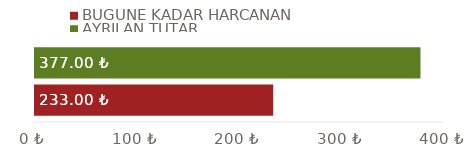
| Category | BUGÜNE KADAR HARCANAN | AYRILAN TUTAR |
|---|---|---|
| TOPLAMLAR | 233 | 377 |